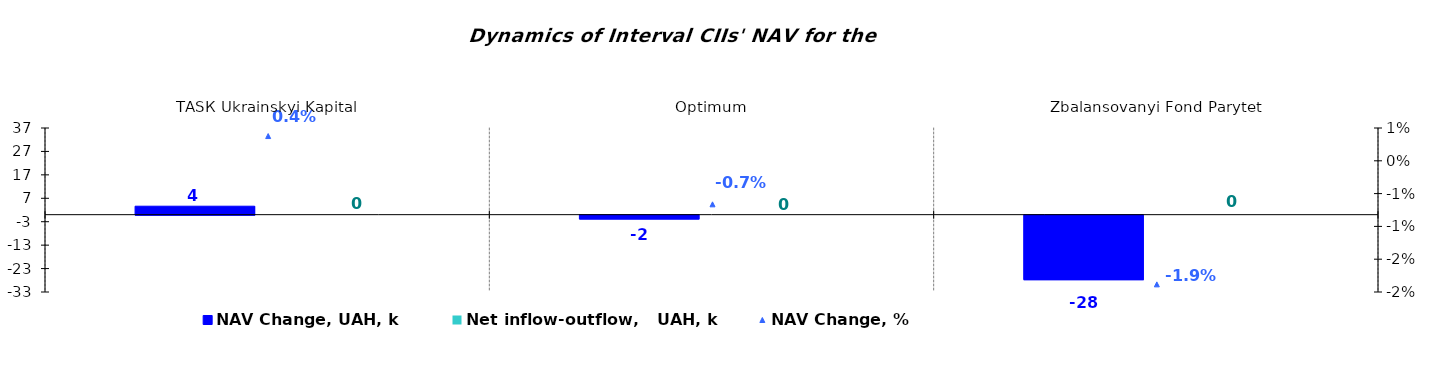
| Category | NAV Change, UAH, k | Net inflow-outflow,   UAH, k |
|---|---|---|
| ТАSК Ukrainskyi Kapital | 3.618 | 0 |
| Optimum | -1.652 | 0 |
| Zbalansovanyi Fond Parytet | -27.527 | 0 |